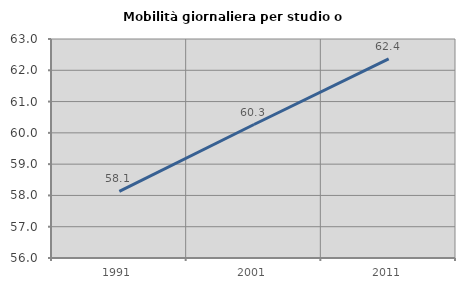
| Category | Mobilità giornaliera per studio o lavoro |
|---|---|
| 1991.0 | 58.127 |
| 2001.0 | 60.267 |
| 2011.0 | 62.363 |